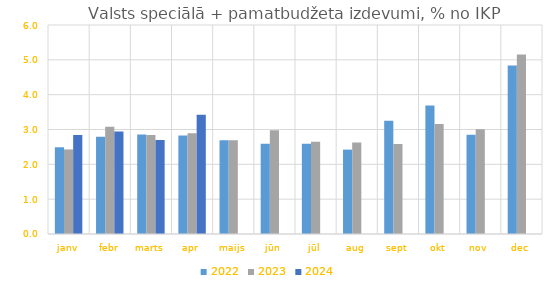
| Category | 2022 | 2023 | 2024 |
|---|---|---|---|
| janv | 2.487 | 2.428 | 2.842 |
| febr | 2.789 | 3.078 | 2.939 |
| marts | 2.856 | 2.845 | 2.697 |
| apr | 2.827 | 2.889 | 3.424 |
| maijs | 2.689 | 2.693 | 0 |
| jūn | 2.59 | 2.975 | 0 |
| jūl | 2.592 | 2.65 | 0 |
| aug | 2.422 | 2.625 | 0 |
| sept | 3.25 | 2.583 | 0 |
| okt | 3.688 | 3.159 | 0 |
| nov | 2.847 | 3.01 | 0 |
| dec | 4.838 | 5.152 | 0 |